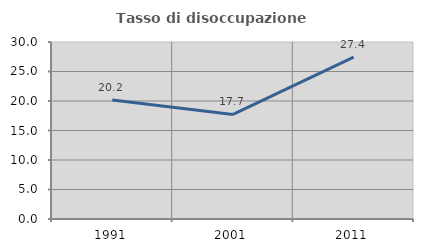
| Category | Tasso di disoccupazione giovanile  |
|---|---|
| 1991.0 | 20.155 |
| 2001.0 | 17.722 |
| 2011.0 | 27.419 |